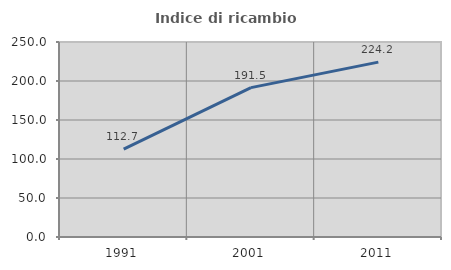
| Category | Indice di ricambio occupazionale  |
|---|---|
| 1991.0 | 112.661 |
| 2001.0 | 191.515 |
| 2011.0 | 224.2 |